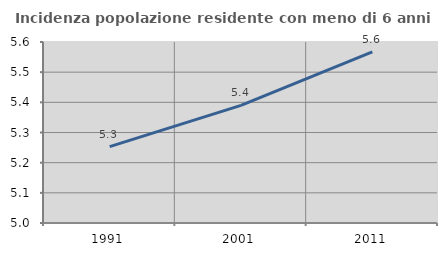
| Category | Incidenza popolazione residente con meno di 6 anni |
|---|---|
| 1991.0 | 5.253 |
| 2001.0 | 5.39 |
| 2011.0 | 5.568 |